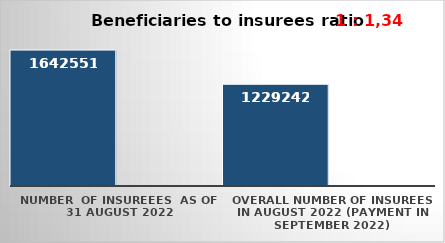
| Category | Series 0 | Series 1 |
|---|---|---|
| NUMBER  of insureees  as of  31 August 2022 | 1642551 |  |
| OVERALL number of insurees in August 2022 (payment in September 2022) | 1229242 |  |